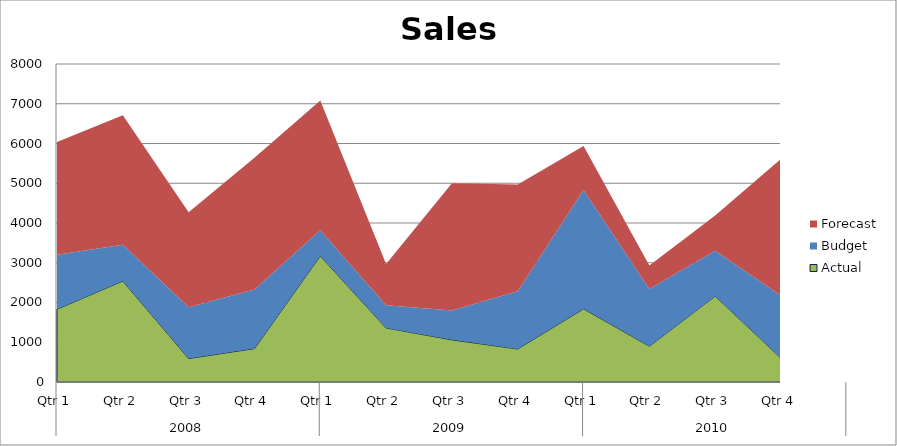
| Category | Actual | Budget | Forecast |
|---|---|---|---|
| 0 | 1830 | 1370 | 2840 |
| 1 | 2540 | 910 | 3260 |
| 2 | 590 | 1290 | 2390 |
| 3 | 840 | 1490 | 3310 |
| 4 | 3170 | 650 | 3260 |
| 5 | 1360 | 570 | 1040 |
| 6 | 1060 | 740 | 3200 |
| 7 | 830 | 1450 | 2690 |
| 8 | 1840 | 2990 | 1110 |
| 9 | 900 | 1440 | 590 |
| 10 | 2160 | 1140 | 890 |
| 11 | 600 | 1570 | 3440 |